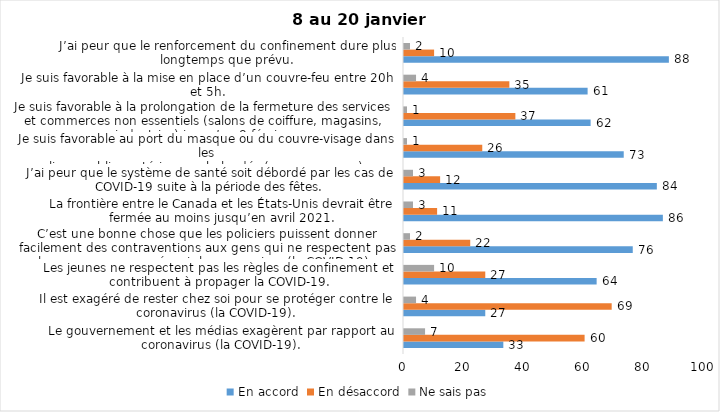
| Category | En accord | En désaccord | Ne sais pas |
|---|---|---|---|
| Le gouvernement et les médias exagèrent par rapport au coronavirus (la COVID-19). | 33 | 60 | 7 |
| Il est exagéré de rester chez soi pour se protéger contre le coronavirus (la COVID-19). | 27 | 69 | 4 |
| Les jeunes ne respectent pas les règles de confinement et contribuent à propager la COVID-19. | 64 | 27 | 10 |
| C’est une bonne chose que les policiers puissent donner facilement des contraventions aux gens qui ne respectent pas les mesures pour prévenir le coronavirus (la COVID-19). | 76 | 22 | 2 |
| La frontière entre le Canada et les États-Unis devrait être fermée au moins jusqu’en avril 2021. | 86 | 11 | 3 |
| J’ai peur que le système de santé soit débordé par les cas de COVID-19 suite à la période des fêtes. | 84 | 12 | 3 |
| Je suis favorable au port du masque ou du couvre-visage dans les
lieux publics extérieurs achalandés (ex. rues, parcs) | 73 | 26 | 1 |
| Je suis favorable à la prolongation de la fermeture des services et commerces non essentiels (salons de coiffure, magasins, industries) jusqu’au 8 février. | 62 | 37 | 1 |
| Je suis favorable à la mise en place d’un couvre-feu entre 20h et 5h. | 61 | 35 | 4 |
| J’ai peur que le renforcement du confinement dure plus longtemps que prévu. | 88 | 10 | 2 |